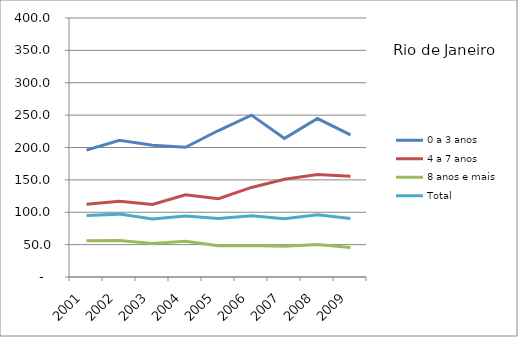
| Category | 0 a 3 anos | 4 a 7 anos | 8 anos e mais | Total |
|---|---|---|---|---|
| 2001.0 | 195.9 | 112.3 | 56.1 | 94.8 |
| 2002.0 | 211 | 117 | 56.3 | 97.1 |
| 2003.0 | 203.6 | 111.9 | 51.6 | 89.7 |
| 2004.0 | 200.3 | 127.1 | 55.2 | 94.3 |
| 2005.0 | 226.2 | 120.9 | 48.4 | 90.2 |
| 2006.0 | 250 | 138.3 | 48.8 | 94.7 |
| 2007.0 | 214.1 | 151 | 47.5 | 90 |
| 2008.0 | 244.7 | 158.2 | 50 | 96 |
| 2009.0 | 219.5 | 155.5 | 45.7 | 90.5 |